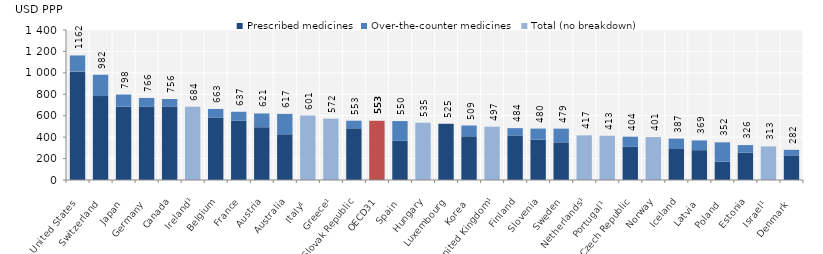
| Category | Prescribed medicines | Over-the-counter medicines  | Total (no breakdown) |
|---|---|---|---|
| United States | 1011.391 | 151.008 | 0 |
| Switzerland | 783.28 | 198.926 | 0 |
| Japan | 684.564 | 113.303 | 0 |
| Germany | 685.761 | 80.114 | 0 |
| Canada | 684.935 | 70.884 | 0 |
| Ireland¹ | 0 | 0 | 684.269 |
| Belgium | 583.573 | 79.471 | 0 |
| France | 552.704 | 83.996 | 0 |
| Austria | 492.456 | 128.434 | 0 |
| Australia | 426.676 | 190.311 | 0 |
| Italy¹ | 0 | 0 | 601.018 |
| Greece¹ | 571.913 | 0 | 0 |
| Slovak Republic | 482.314 | 70.954 | 0 |
| OECD31 | 0 | 0 | 552.698 |
| Spain | 365.656 | 184.316 | 0 |
| Hungary | 0 | 0 | 534.557 |
| Luxembourg | 524.723 | 0 | 0 |
| Korea | 408.05 | 100.52 | 0 |
| United Kingdom¹ | 0 | 0 | 497.394 |
| Finland | 416.273 | 67.596 | 0 |
| Slovenia | 375.656 | 104.259 | 0 |
| Sweden | 351.168 | 128.288 | 0 |
| Netherlands¹ | 0 | 0 | 416.594 |
| Portugal¹ | 0 | 0 | 412.877 |
| Czech Republic | 309.63 | 94.674 | 0 |
| Norway | 400.871 | 0 | 0 |
| Iceland | 289.088 | 97.56 | 0 |
| Latvia | 278.293 | 90.989 | 0 |
| Poland | 170.529 | 181.03 | 0 |
| Estonia | 255.805 | 70.029 | 0 |
| Israel¹ | 0 | 0 | 313.203 |
| Denmark | 229.83 | 51.924 | 0 |